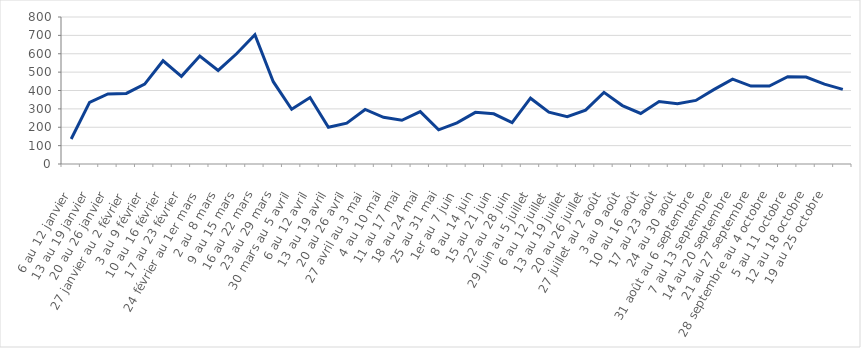
| Category | 2020 |
|---|---|
| 6 au 12 janvier | 136 |
| 13 au 19 janvier | 335 |
| 20 au 26 janvier | 381 |
| 27 janvier au 2 février | 384 |
| 3 au 9 février | 435 |
| 10 au 16 février | 562 |
| 17 au 23 février | 477 |
| 24 février au 1er mars | 588 |
| 2 au 8 mars | 509 |
| 9 au 15 mars | 600 |
| 16 au 22 mars | 704 |
| 23 au 29 mars | 448 |
| 30 mars au 5 avril | 298 |
| 6 au 12 avril | 362 |
| 13 au 19 avril | 200 |
| 20 au 26 avril | 222 |
| 27 avril au 3 mai | 297 |
| 4 au 10 mai | 254 |
| 11 au 17 mai | 238 |
| 18 au 24 mai | 285 |
| 25 au 31 mai | 186 |
| 1er au 7 juin | 224 |
| 8 au 14 juin | 281 |
| 15 au 21 juin | 273 |
| 22 au 28 juin | 225 |
| 29 juin au 5 juillet | 358 |
| 6 au 12 juillet | 282 |
| 13 au 19 juillet | 257 |
| 20 au 26 juillet | 293 |
| 27 juillet au 2 août | 390 |
| 3 au 9 août | 318 |
| 10 au 16 août | 275 |
| 17 au 23 août | 340 |
| 24 au 30 août | 328 |
| 31 août au 6 septembre | 346 |
| 7 au 13 septembre | 406 |
| 14 au 20 septembre | 462 |
| 21 au 27 septembre | 424 |
| 28 septembre au 4 octobre | 424 |
| 5 au 11 octobre | 475 |
| 12 au 18 octobre | 473 |
| 19 au 25 octobre | 435 |